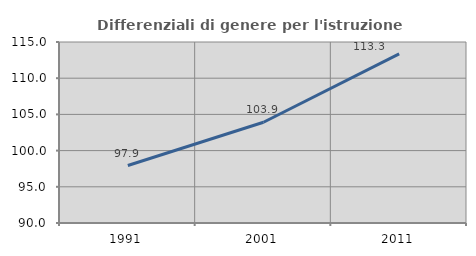
| Category | Differenziali di genere per l'istruzione superiore |
|---|---|
| 1991.0 | 97.937 |
| 2001.0 | 103.911 |
| 2011.0 | 113.349 |